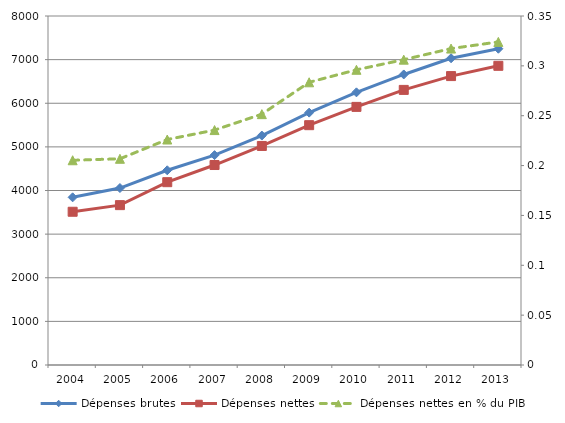
| Category | Dépenses brutes | Dépenses nettes |
|---|---|---|
| 2004.0 | 3843.372 | 3512.616 |
| 2005.0 | 4056.445 | 3664.527 |
| 2006.0 | 4463.257 | 4190.749 |
| 2007.0 | 4810.944 | 4583.942 |
| 2008.0 | 5259.653 | 5020.976 |
| 2009.0 | 5785.329 | 5497.47 |
| 2010.0 | 6250.164 | 5916.608 |
| 2011.0 | 6659.913 | 6305.903 |
| 2012.0 | 7031.403 | 6622.69 |
| 2013.0 | 7249.711 | 6857.966 |